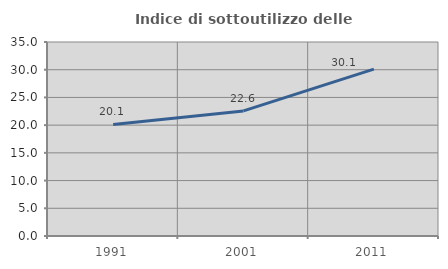
| Category | Indice di sottoutilizzo delle abitazioni  |
|---|---|
| 1991.0 | 20.131 |
| 2001.0 | 22.569 |
| 2011.0 | 30.114 |